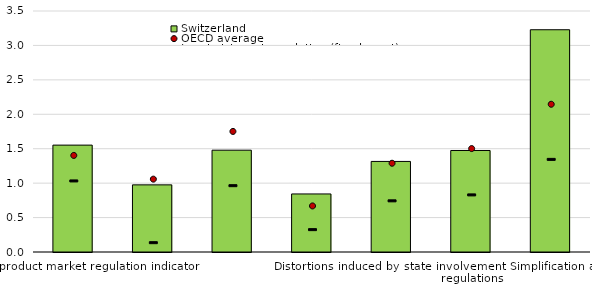
| Category | Switzerland |
|---|---|
| 0 | 1.552 |
| 1 | 0.975 |
| 2 | 1.479 |
| 3 | 0.843 |
| 4 | 1.315 |
| 5 | 1.474 |
| 6 | 3.228 |